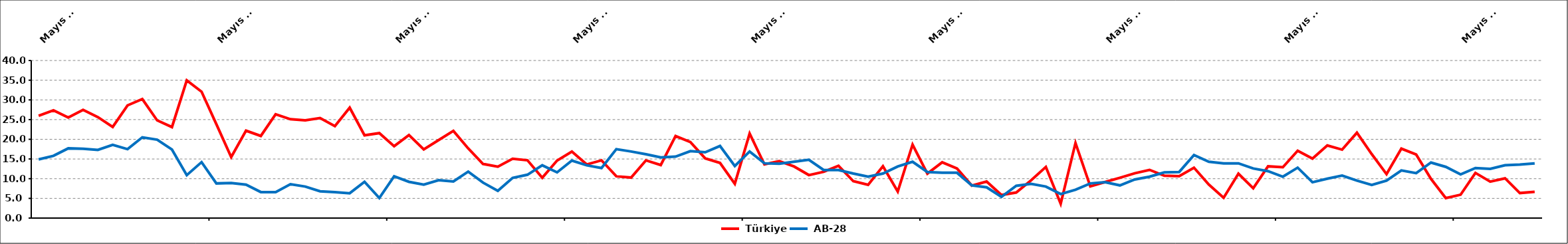
| Category |  Türkiye |  AB-28 |
|---|---|---|
| 2008-05-01 | 25.962 | 14.9 |
| 2008-06-01 | 27.357 | 15.8 |
| 2008-07-01 | 25.518 | 17.7 |
| 2008-08-01 | 27.49 | 17.6 |
| 2008-09-01 | 25.621 | 17.3 |
| 2008-10-01 | 23.136 | 18.6 |
| 2008-11-01 | 28.603 | 17.5 |
| 2008-12-01 | 30.209 | 20.5 |
| 2009-01-01 | 24.807 | 19.9 |
| 2009-02-01 | 23.1 | 17.4 |
| 2009-03-01 | 34.957 | 10.9 |
| 2009-04-01 | 32.073 | 14.2 |
| 2009-05-01 | 23.814 | 8.8 |
| 2009-06-01 | 15.481 | 8.9 |
| 2009-07-01 | 22.193 | 8.5 |
| 2009-08-01 | 20.848 | 6.6 |
| 2009-09-01 | 26.349 | 6.6 |
| 2009-10-01 | 25.086 | 8.6 |
| 2009-11-01 | 24.827 | 8 |
| 2009-12-01 | 25.397 | 6.8 |
| 2010-01-01 | 23.329 | 6.6 |
| 2010-02-01 | 28.027 | 6.3 |
| 2010-03-01 | 21.008 | 9.2 |
| 2010-04-01 | 21.578 | 5.1 |
| 2010-05-01 | 18.248 | 10.6 |
| 2010-06-01 | 21.087 | 9.2 |
| 2010-07-01 | 17.449 | 8.5 |
| 2010-08-01 | 19.797 | 9.6 |
| 2010-09-01 | 22.129 | 9.3 |
| 2010-10-01 | 17.682 | 11.8 |
| 2010-11-01 | 13.744 | 9 |
| 2010-12-01 | 13.037 | 6.9 |
| 2011-01-01 | 15.048 | 10.2 |
| 2011-02-01 | 14.671 | 11 |
| 2011-03-01 | 10.238 | 13.4 |
| 2011-04-01 | 14.609 | 11.6 |
| 2011-05-01 | 16.865 | 14.6 |
| 2011-06-01 | 13.615 | 13.4 |
| 2011-07-01 | 14.655 | 12.7 |
| 2011-08-01 | 10.608 | 17.5 |
| 2011-09-01 | 10.279 | 16.9 |
| 2011-10-01 | 14.65 | 16.2 |
| 2011-11-01 | 13.462 | 15.4 |
| 2011-12-01 | 20.836 | 15.6 |
| 2012-01-01 | 19.296 | 17 |
| 2012-02-01 | 15.167 | 16.7 |
| 2012-03-01 | 14.002 | 18.3 |
| 2012-04-01 | 8.711 | 13.2 |
| 2012-05-01 | 21.463 | 16.9 |
| 2012-06-01 | 13.63 | 13.9 |
| 2012-07-01 | 14.45 | 13.8 |
| 2012-08-01 | 13.09 | 14.3 |
| 2012-09-01 | 10.914 | 14.8 |
| 2012-10-01 | 11.756 | 12.2 |
| 2012-11-01 | 13.26 | 12.2 |
| 2012-12-01 | 9.359 | 11.3 |
| 2013-01-01 | 8.453 | 10.5 |
| 2013-02-01 | 13.171 | 11.3 |
| 2013-03-01 | 6.754 | 13.1 |
| 2013-04-01 | 18.647 | 14.3 |
| 2013-05-01 | 11.277 | 11.7 |
| 2013-06-01 | 14.169 | 11.5 |
| 2013-07-01 | 12.578 | 11.5 |
| 2013-08-01 | 8.239 | 8.3 |
| 2013-09-01 | 9.283 | 7.8 |
| 2013-10-01 | 5.86 | 5.4 |
| 2013-11-01 | 6.485 | 8.2 |
| 2013-12-01 | 9.567 | 8.7 |
| 2014-01-01 | 12.977 | 8 |
| 2014-02-01 | 3.65 | 6.1 |
| 2014-03-02 | 19.061 | 7.2 |
| 2014-04-02 | 8.043 | 8.8 |
| 2014-05-02 | 9.152 | 9.1 |
| 2014-06-02 | 10.225 | 8.3 |
| 2014-07-02 | 11.373 | 9.8 |
| 2014-08-02 | 12.238 | 10.5 |
| 2014-09-02 | 10.745 | 11.6 |
| 2014-10-02 | 10.622 | 11.7 |
| 2014-11-02 | 12.793 | 16 |
| 2014-12-02 | 8.518 | 14.3 |
| 2015-01-02 | 5.149 | 13.9 |
| 2015-02-02 | 11.259 | 13.9 |
| 2015-03-02 | 7.585 | 12.6 |
| 2015-04-02 | 13.14 | 11.9 |
| 2015-05-02 | 12.908 | 10.5 |
| 2015-06-02 | 17.108 | 12.8 |
| 2015-07-02 | 15.088 | 9.1 |
| 2015-08-02 | 18.444 | 10 |
| 2015-09-02 | 17.371 | 10.8 |
| 2015-10-02 | 21.675 | 9.5 |
| 2015-11-02 | 16.236 | 8.4 |
| 2015-12-02 | 11.168 | 9.5 |
| 2016-01-02 | 17.619 | 12.1 |
| 2016-02-02 | 16.123 | 11.4 |
| 2016-03-02 | 9.959 | 14.1 |
| 2016-04-02 | 5.064 | 13 |
| 2016-05-02 | 5.934 | 11.1 |
| 2016-06-02 | 11.466 | 12.7 |
| 2016-07-03 | 9.242 | 12.5 |
| 2016-08-03 | 10.096 | 13.4 |
| 2016-09-03 | 6.353 | 13.6 |
| 2016-10-03 | 6.665 | 13.9 |